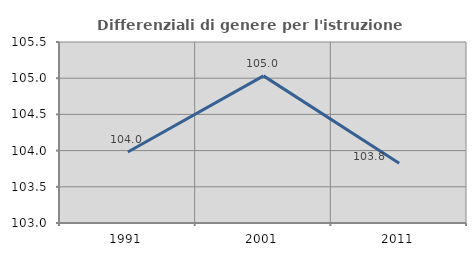
| Category | Differenziali di genere per l'istruzione superiore |
|---|---|
| 1991.0 | 103.98 |
| 2001.0 | 105.032 |
| 2011.0 | 103.826 |